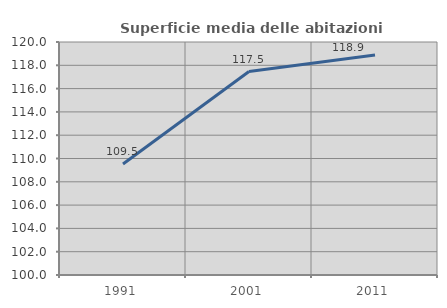
| Category | Superficie media delle abitazioni occupate |
|---|---|
| 1991.0 | 109.523 |
| 2001.0 | 117.466 |
| 2011.0 | 118.882 |